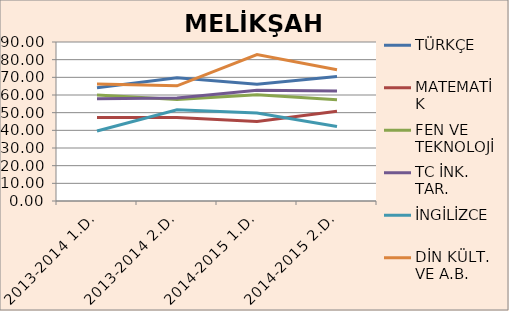
| Category | TÜRKÇE | MATEMATİK | FEN VE TEKNOLOJİ | TC İNK. TAR. | İNGİLİZCE | DİN KÜLT. VE A.B. |
|---|---|---|---|---|---|---|
| 2013-2014 1.D. | 64.09 | 47.32 | 59.98 | 57.85 | 39.59 | 66.24 |
| 2013-2014 2.D. | 69.79 | 47.23 | 57.52 | 58.35 | 51.62 | 65.17 |
| 2014-2015 1.D. | 66.14 | 45.06 | 60.11 | 62.73 | 49.83 | 82.9 |
| 2014-2015 2.D. | 70.51 | 50.79 | 57.36 | 62.3 | 42.16 | 74.33 |